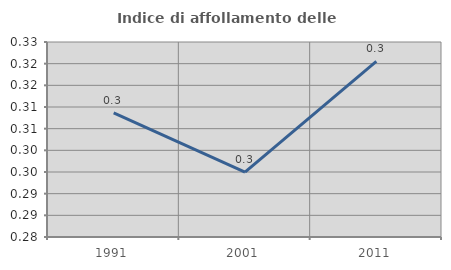
| Category | Indice di affollamento delle abitazioni  |
|---|---|
| 1991.0 | 0.309 |
| 2001.0 | 0.295 |
| 2011.0 | 0.321 |